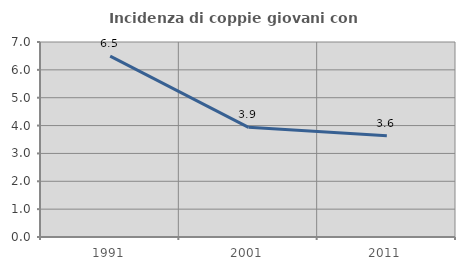
| Category | Incidenza di coppie giovani con figli |
|---|---|
| 1991.0 | 6.494 |
| 2001.0 | 3.937 |
| 2011.0 | 3.636 |